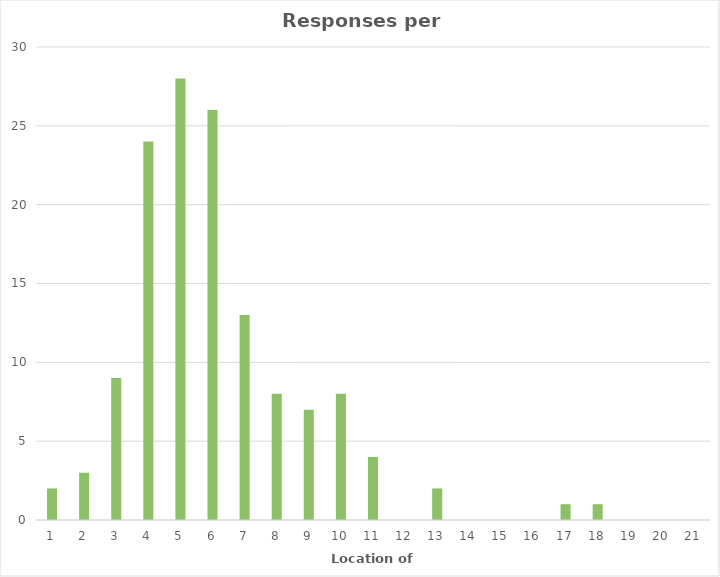
| Category | Location |
|---|---|
| 1.0 | 2 |
| 2.0 | 3 |
| 3.0 | 9 |
| 4.0 | 24 |
| 5.0 | 28 |
| 6.0 | 26 |
| 7.0 | 13 |
| 8.0 | 8 |
| 9.0 | 7 |
| 10.0 | 8 |
| 11.0 | 4 |
| 12.0 | 0 |
| 13.0 | 2 |
| 14.0 | 0 |
| 15.0 | 0 |
| 16.0 | 0 |
| 17.0 | 1 |
| 18.0 | 1 |
| 19.0 | 0 |
| 20.0 | 0 |
| 21.0 | 0 |